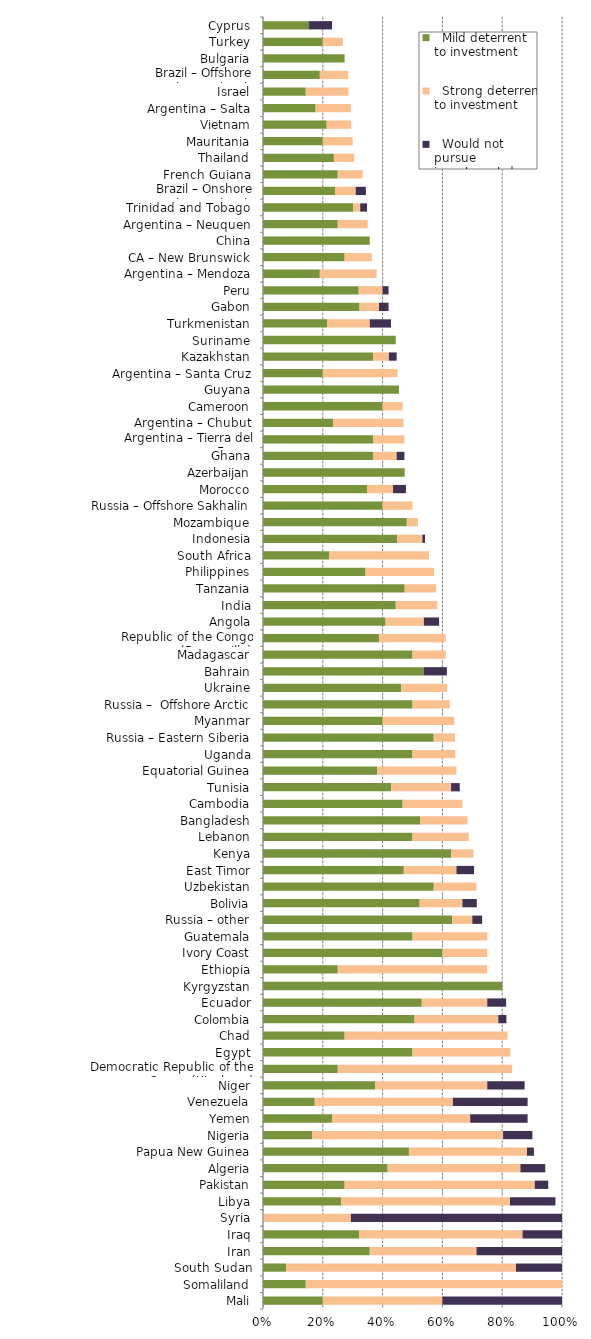
| Category |   Mild deterrent to investment |   Strong deterrent to investment |   Would not pursue investment due to this factor |
|---|---|---|---|
| Mali | 0.2 | 0.4 | 0.4 |
| Somaliland | 0.143 | 0.857 | 0 |
| South Sudan | 0.077 | 0.769 | 0.154 |
| Iran | 0.357 | 0.357 | 0.286 |
| Iraq | 0.321 | 0.547 | 0.132 |
| Syria | 0 | 0.294 | 0.706 |
| Libya | 0.261 | 0.565 | 0.152 |
| Pakistan | 0.273 | 0.636 | 0.045 |
| Algeria | 0.417 | 0.444 | 0.083 |
| Papua New Guinea | 0.488 | 0.395 | 0.023 |
| Nigeria | 0.164 | 0.639 | 0.098 |
| Yemen | 0.231 | 0.462 | 0.192 |
| Venezuela | 0.173 | 0.462 | 0.25 |
| Niger | 0.375 | 0.375 | 0.125 |
| Democratic Republic of the Congo (Kinshasa) | 0.25 | 0.583 | 0 |
| Egypt | 0.5 | 0.327 | 0 |
| Chad | 0.273 | 0.545 | 0 |
| Colombia | 0.507 | 0.28 | 0.027 |
| Ecuador | 0.531 | 0.219 | 0.063 |
| Kyrgyzstan | 0.8 | 0 | 0 |
| Ethiopia | 0.25 | 0.5 | 0 |
| Ivory Coast | 0.6 | 0.15 | 0 |
| Guatemala | 0.5 | 0.25 | 0 |
| Russia – other | 0.633 | 0.067 | 0.033 |
| Bolivia | 0.524 | 0.143 | 0.048 |
| Uzbekistan | 0.571 | 0.143 | 0 |
| East Timor | 0.471 | 0.176 | 0.059 |
| Kenya | 0.63 | 0.074 | 0 |
| Lebanon | 0.5 | 0.188 | 0 |
| Bangladesh | 0.526 | 0.158 | 0 |
| Cambodia | 0.467 | 0.2 | 0 |
| Tunisia | 0.429 | 0.2 | 0.029 |
| Equatorial Guinea | 0.382 | 0.265 | 0 |
| Uganda | 0.5 | 0.143 | 0 |
| Russia – Eastern Siberia | 0.571 | 0.071 | 0 |
| Myanmar | 0.4 | 0.24 | 0 |
| Russia –  Offshore Arctic | 0.5 | 0.125 | 0 |
| Ukraine | 0.462 | 0.154 | 0 |
| Bahrain | 0.538 | 0 | 0.077 |
| Madagascar | 0.5 | 0.111 | 0 |
| Republic of the Congo (Brazzaville) | 0.389 | 0.222 | 0 |
| Angola | 0.41 | 0.128 | 0.051 |
| India | 0.444 | 0.139 | 0 |
| Tanzania | 0.474 | 0.105 | 0 |
| Philippines | 0.343 | 0.229 | 0 |
| South Africa | 0.222 | 0.333 | 0 |
| Indonesia | 0.449 | 0.084 | 0.009 |
| Mozambique | 0.481 | 0.037 | 0 |
| Russia – Offshore Sakhalin | 0.4 | 0.1 | 0 |
| Morocco | 0.348 | 0.087 | 0.043 |
| Azerbaijan | 0.474 | 0 | 0 |
| Ghana | 0.368 | 0.079 | 0.026 |
| Argentina – Tierra del Fuego | 0.368 | 0.105 | 0 |
| Argentina – Chubut | 0.235 | 0.235 | 0 |
| Cameroon | 0.4 | 0.067 | 0 |
| Guyana | 0.455 | 0 | 0 |
| Argentina – Santa Cruz | 0.2 | 0.25 | 0 |
| Kazakhstan | 0.368 | 0.053 | 0.026 |
| Suriname | 0.444 | 0 | 0 |
| Turkmenistan | 0.214 | 0.143 | 0.071 |
| Gabon | 0.323 | 0.065 | 0.032 |
| Peru | 0.32 | 0.08 | 0.02 |
| Argentina – Mendoza | 0.19 | 0.19 | 0 |
| CA – New Brunswick | 0.273 | 0.091 | 0 |
| China | 0.357 | 0 | 0 |
| Argentina – Neuquen | 0.25 | 0.1 | 0 |
| Trinidad and Tobago | 0.302 | 0.023 | 0.023 |
| Brazil – Onshore concession contracts | 0.241 | 0.069 | 0.034 |
| French Guiana | 0.25 | 0.083 | 0 |
| Thailand | 0.237 | 0.068 | 0 |
| Mauritania | 0.2 | 0.1 | 0 |
| Vietnam | 0.213 | 0.082 | 0 |
| Argentina – Salta | 0.176 | 0.118 | 0 |
| Israel | 0.143 | 0.143 | 0 |
| Brazil – Offshore concession contracts | 0.19 | 0.095 | 0 |
| Bulgaria | 0.273 | 0 | 0 |
| Turkey | 0.2 | 0.067 | 0 |
| Cyprus | 0.154 | 0 | 0.077 |